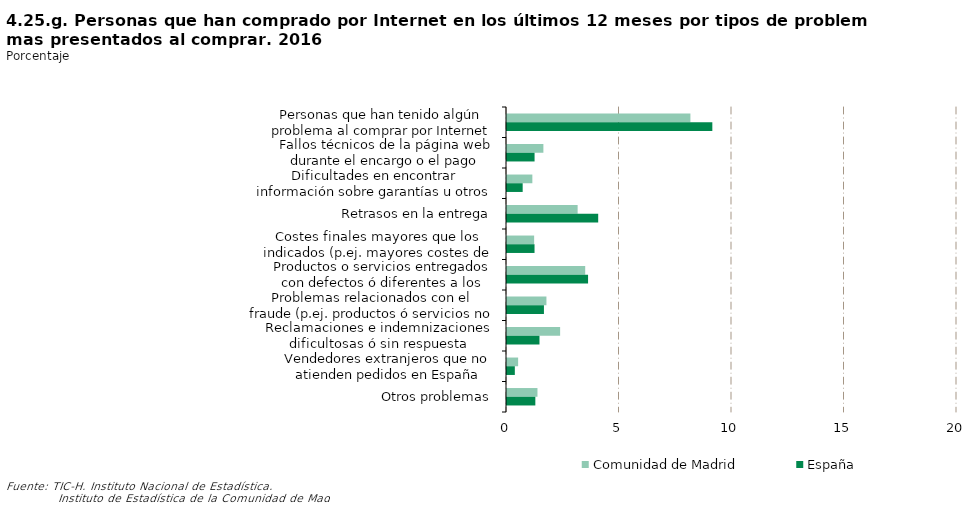
| Category | Comunidad de Madrid | España |
|---|---|---|
| Personas que han tenido algún problema al comprar por Internet en los últimos 12 meses | 8.151 | 9.126 |
| Fallos técnicos de la página web durante el encargo o el pago | 1.617 | 1.225 |
| Dificultades en encontrar información sobre garantías u otros derechos legales | 1.127 | 0.697 |
| Retrasos en la entrega | 3.139 | 4.053 |
| Costes finales mayores que los indicados (p.ej. mayores costes de entrega, gastos inesperados en la transacción, etc.) | 1.206 | 1.224 |
| Productos o servicios entregados con defectos ó diferentes a los encargados | 3.476 | 3.603 |
| Problemas relacionados con el fraude (p.ej. productos ó servicios no recibidos ó no recibidos en su totalidad, mal uso de los datos de la tarjeta de crédito, etc.) | 1.752 | 1.642 |
| Reclamaciones e indemnizaciones dificultosas ó sin respuesta satisfactoria tras la reclamación | 2.361 | 1.443 |
| Vendedores extranjeros que no atienden pedidos en España | 0.494 | 0.348 |
| Otros problemas | 1.354 | 1.26 |